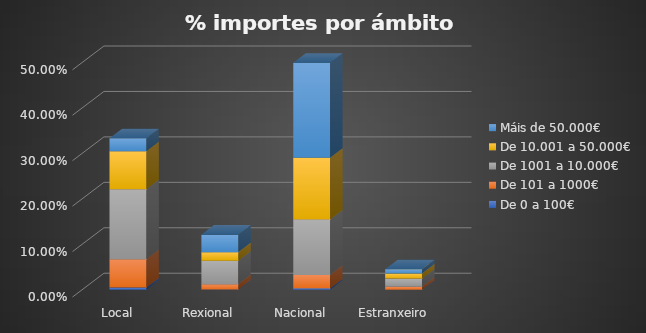
| Category | De 0 a 100€ | De 101 a 1000€ | De 1001 a 10.000€ | De 10.001 a 50.000€ | Máis de 50.000€ |
|---|---|---|---|---|---|
| Local | 0.005 | 0.062 | 0.154 | 0.084 | 0.029 |
| Rexional | 0.001 | 0.012 | 0.052 | 0.019 | 0.039 |
| Nacional | 0.003 | 0.03 | 0.122 | 0.136 | 0.209 |
| Estranxeiro | 0 | 0.007 | 0.018 | 0.011 | 0.009 |